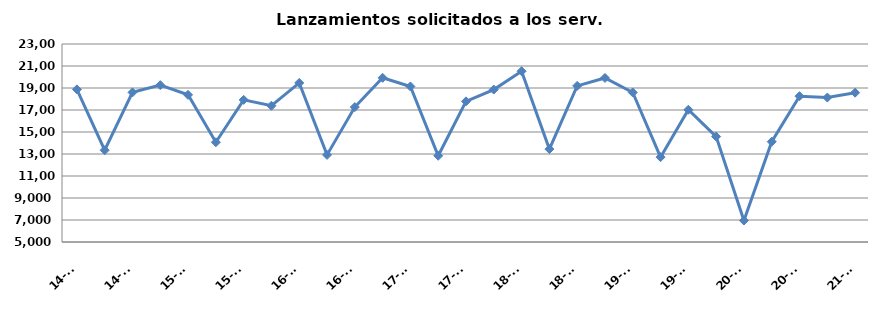
| Category | Lanzamientos solicitados a los Serv. comunes |
|---|---|
| 14-T2 | 18876 |
| 14-T3 | 13342 |
| 14-T4 | 18603 |
| 15-T1 | 19261 |
| 15-T2 | 18378 |
| 15-T3 | 14071 |
| 15-T4 | 17921 |
| 16-T1 | 17386 |
| 16-T2 | 19461 |
| 16-T3 | 12918 |
| 16-T4 | 17265 |
| 17-T1 | 19926 |
| 17-T2 | 19141 |
| 17-T3 | 12840 |
| 17-T4 | 17786 |
| 18-T1 | 18859 |
| 18-T2 | 20526 |
| 18-T3 | 13446 |
| 18-T4 | 19192 |
| 19-T1 | 19913 |
| 19-T2 | 18594 |
| 19-T3 | 12715 |
| 19-T4 | 17025 |
| 20-T1 | 14586 |
| 20-T2 | 6953 |
| 20-T3 | 14117 |
| 20-T4 | 18255 |
| 21-T1 | 18131 |
| 21-T2 | 18574 |